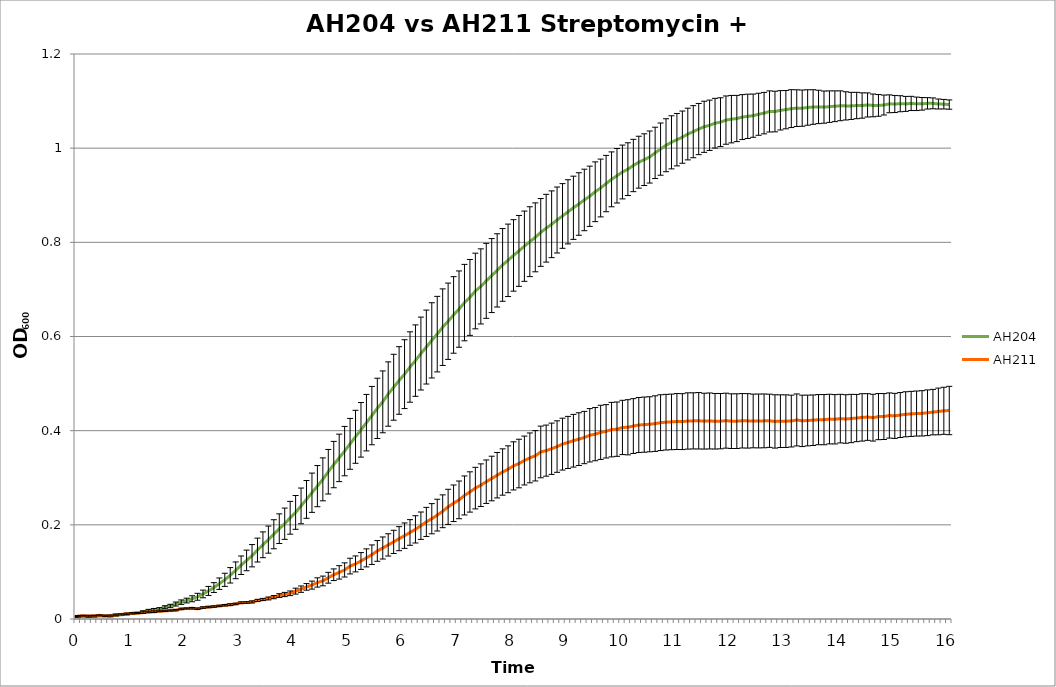
| Category | AH204 | AH211 |
|---|---|---|
| 0.0 | 0.004 | 0.006 |
| nan | 0.006 | 0.007 |
| nan | 0.005 | 0.006 |
| nan | 0.005 | 0.007 |
| nan | 0.006 | 0.008 |
| nan | 0.006 | 0.007 |
| nan | 0.006 | 0.007 |
| nan | 0.008 | 0.009 |
| nan | 0.009 | 0.01 |
| nan | 0.01 | 0.011 |
| 1.0 | 0.012 | 0.012 |
| nan | 0.013 | 0.013 |
| nan | 0.015 | 0.014 |
| nan | 0.018 | 0.015 |
| nan | 0.02 | 0.015 |
| nan | 0.021 | 0.016 |
| nan | 0.025 | 0.017 |
| nan | 0.028 | 0.018 |
| nan | 0.032 | 0.019 |
| nan | 0.036 | 0.021 |
| 2.0 | 0.039 | 0.022 |
| nan | 0.043 | 0.023 |
| nan | 0.047 | 0.022 |
| nan | 0.053 | 0.024 |
| nan | 0.06 | 0.025 |
| nan | 0.067 | 0.026 |
| nan | 0.075 | 0.028 |
| nan | 0.083 | 0.029 |
| nan | 0.093 | 0.03 |
| nan | 0.103 | 0.032 |
| 3.0 | 0.114 | 0.035 |
| nan | 0.124 | 0.035 |
| nan | 0.134 | 0.036 |
| nan | 0.146 | 0.039 |
| nan | 0.158 | 0.041 |
| nan | 0.169 | 0.044 |
| nan | 0.18 | 0.046 |
| nan | 0.192 | 0.05 |
| nan | 0.202 | 0.052 |
| nan | 0.215 | 0.055 |
| 4.0 | 0.226 | 0.059 |
| nan | 0.24 | 0.063 |
| nan | 0.254 | 0.068 |
| nan | 0.268 | 0.072 |
| nan | 0.282 | 0.078 |
| nan | 0.297 | 0.081 |
| nan | 0.313 | 0.088 |
| nan | 0.328 | 0.094 |
| nan | 0.342 | 0.099 |
| nan | 0.357 | 0.104 |
| 5.0 | 0.372 | 0.112 |
| nan | 0.387 | 0.117 |
| nan | 0.402 | 0.123 |
| nan | 0.417 | 0.13 |
| nan | 0.432 | 0.137 |
| nan | 0.447 | 0.145 |
| nan | 0.461 | 0.151 |
| nan | 0.478 | 0.157 |
| nan | 0.492 | 0.164 |
| nan | 0.507 | 0.171 |
| 6.0 | 0.52 | 0.177 |
| nan | 0.535 | 0.184 |
| nan | 0.549 | 0.19 |
| nan | 0.564 | 0.198 |
| nan | 0.578 | 0.206 |
| nan | 0.592 | 0.213 |
| nan | 0.605 | 0.221 |
| nan | 0.62 | 0.229 |
| nan | 0.632 | 0.238 |
| nan | 0.646 | 0.246 |
| 7.0 | 0.658 | 0.253 |
| nan | 0.672 | 0.262 |
| nan | 0.683 | 0.27 |
| nan | 0.697 | 0.278 |
| nan | 0.706 | 0.284 |
| nan | 0.718 | 0.292 |
| nan | 0.729 | 0.298 |
| nan | 0.74 | 0.305 |
| nan | 0.752 | 0.312 |
| nan | 0.762 | 0.318 |
| 8.0 | 0.772 | 0.325 |
| nan | 0.782 | 0.33 |
| nan | 0.792 | 0.337 |
| nan | 0.801 | 0.342 |
| nan | 0.811 | 0.347 |
| nan | 0.821 | 0.355 |
| nan | 0.83 | 0.358 |
| nan | 0.838 | 0.362 |
| nan | 0.847 | 0.366 |
| nan | 0.856 | 0.371 |
| 9.0 | 0.865 | 0.375 |
| nan | 0.873 | 0.379 |
| nan | 0.881 | 0.382 |
| nan | 0.89 | 0.385 |
| nan | 0.898 | 0.39 |
| nan | 0.907 | 0.393 |
| nan | 0.915 | 0.396 |
| nan | 0.925 | 0.399 |
| nan | 0.934 | 0.402 |
| nan | 0.941 | 0.403 |
| 10.0 | 0.949 | 0.407 |
| nan | 0.955 | 0.407 |
| nan | 0.963 | 0.41 |
| nan | 0.97 | 0.412 |
| nan | 0.976 | 0.413 |
| nan | 0.981 | 0.414 |
| nan | 0.99 | 0.415 |
| nan | 0.998 | 0.417 |
| nan | 1.006 | 0.418 |
| nan | 1.012 | 0.419 |
| 11.0 | 1.018 | 0.419 |
| nan | 1.023 | 0.419 |
| nan | 1.03 | 0.421 |
| nan | 1.035 | 0.421 |
| nan | 1.041 | 0.421 |
| nan | 1.045 | 0.42 |
| nan | 1.049 | 0.421 |
| nan | 1.053 | 0.42 |
| nan | 1.055 | 0.42 |
| nan | 1.06 | 0.421 |
| 12.0 | 1.062 | 0.42 |
| nan | 1.063 | 0.42 |
| nan | 1.066 | 0.421 |
| nan | 1.068 | 0.421 |
| nan | 1.069 | 0.421 |
| nan | 1.072 | 0.421 |
| nan | 1.074 | 0.421 |
| nan | 1.078 | 0.421 |
| nan | 1.078 | 0.42 |
| nan | 1.08 | 0.42 |
| 13.0 | 1.082 | 0.42 |
| nan | 1.084 | 0.42 |
| nan | 1.085 | 0.423 |
| nan | 1.085 | 0.421 |
| nan | 1.086 | 0.422 |
| nan | 1.087 | 0.422 |
| nan | 1.088 | 0.423 |
| nan | 1.087 | 0.423 |
| nan | 1.088 | 0.425 |
| nan | 1.089 | 0.424 |
| 14.0 | 1.09 | 0.426 |
| nan | 1.09 | 0.425 |
| nan | 1.09 | 0.426 |
| nan | 1.091 | 0.427 |
| nan | 1.091 | 0.428 |
| nan | 1.092 | 0.429 |
| nan | 1.091 | 0.428 |
| nan | 1.091 | 0.43 |
| nan | 1.092 | 0.43 |
| nan | 1.094 | 0.432 |
| 15.0 | 1.094 | 0.431 |
| nan | 1.094 | 0.433 |
| nan | 1.094 | 0.435 |
| nan | 1.095 | 0.436 |
| nan | 1.094 | 0.436 |
| nan | 1.094 | 0.437 |
| nan | 1.095 | 0.438 |
| nan | 1.095 | 0.439 |
| nan | 1.094 | 0.441 |
| nan | 1.093 | 0.442 |
| 16.0 | 1.093 | 0.443 |